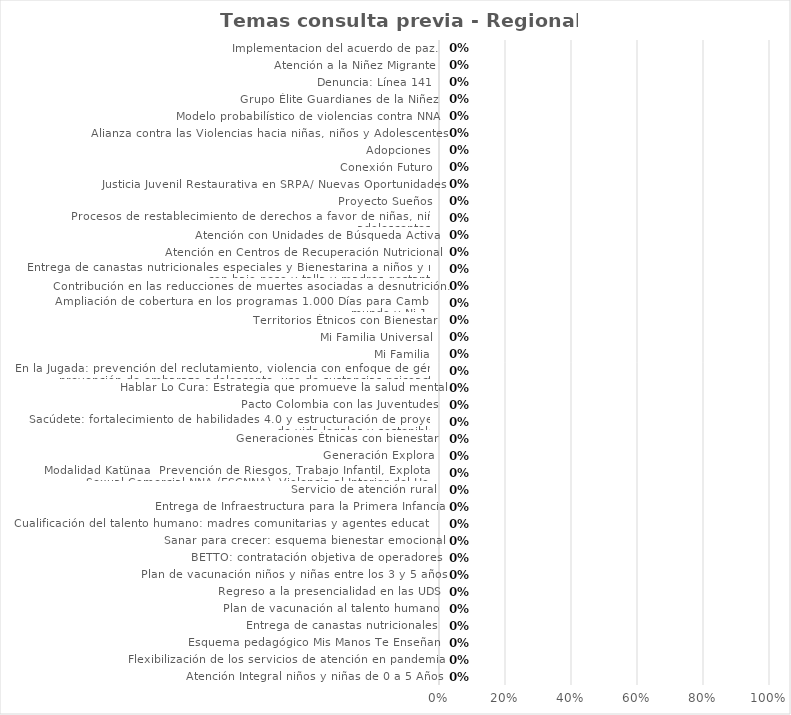
| Category | Temas consulta previa - Regional 0 / 0 |
|---|---|
|  Atención Integral niños y niñas de 0 a 5 Años | 0 |
|  Flexibilización de los servicios de atención en pandemia | 0 |
|  Esquema pedagógico Mis Manos Te Enseñan | 0 |
|  Entrega de canastas nutricionales | 0 |
|  Plan de vacunación al talento humano | 0 |
|  Regreso a la presencialidad en las UDS | 0 |
|  Plan de vacunación niños y niñas entre los 3 y 5 años | 0 |
| BETTO: contratación objetiva de operadores | 0 |
|  Sanar para crecer: esquema bienestar emocional | 0 |
|  Cualificación del talento humano: madres comunitarias y agentes educativos | 0 |
|  Entrega de Infraestructura para la Primera Infancia | 0 |
|  Servicio de atención rural | 0 |
| Modalidad Katünaa  Prevención de Riesgos, Trabajo Infantil, Explotación Sexual Comercial NNA (ESCNNA), Violencia al Interior del Hogar. | 0 |
|  Generación Explora | 0 |
|  Generaciones Étnicas con bienestar | 0 |
|  Sacúdete: fortalecimiento de habilidades 4.0 y estructuración de proyectos de vida legales y sostenibles | 0 |
|  Pacto Colombia con las Juventudes | 0 |
|  Hablar Lo Cura: Estrategia que promueve la salud mental | 0 |
| En la Jugada: prevención del reclutamiento, violencia con enfoque de género; prevención de embarazo adolescente, uso de sustancias psicoactivas | 0 |
|  Mi Familia | 0 |
| Mi Familia Universal | 0 |
| Territorios Étnicos con Bienestar | 0 |
|  Ampliación de cobertura en los programas 1.000 Días para Cambiar el mundo y Ni 1+ | 0 |
|  Contribución en las reducciones de muertes asociadas a desnutrición. | 0 |
|  Entrega de canastas nutricionales especiales y Bienestarina a niños y niñas con bajo peso y talla y madres gestantes. | 0 |
|  Atención en Centros de Recuperación Nutricional | 0 |
|  Atención con Unidades de Búsqueda Activa | 0 |
|  Procesos de restablecimiento de derechos a favor de niñas, niños y adolescentes. | 0 |
| Proyecto Sueños | 0 |
|  Justicia Juvenil Restaurativa en SRPA/ Nuevas Oportunidades | 0 |
|  Conexión Futuro | 0 |
|  Adopciones | 0 |
| Alianza contra las Violencias hacia niñas, niños y Adolescentes | 0 |
| Modelo probabilístico de violencias contra NNA | 0 |
| Grupo Élite Guardianes de la Niñez | 0 |
| Denuncia: Línea 141 | 0 |
|  Atención a la Niñez Migrante | 0 |
| Implementacion del acuerdo de paz. | 0 |